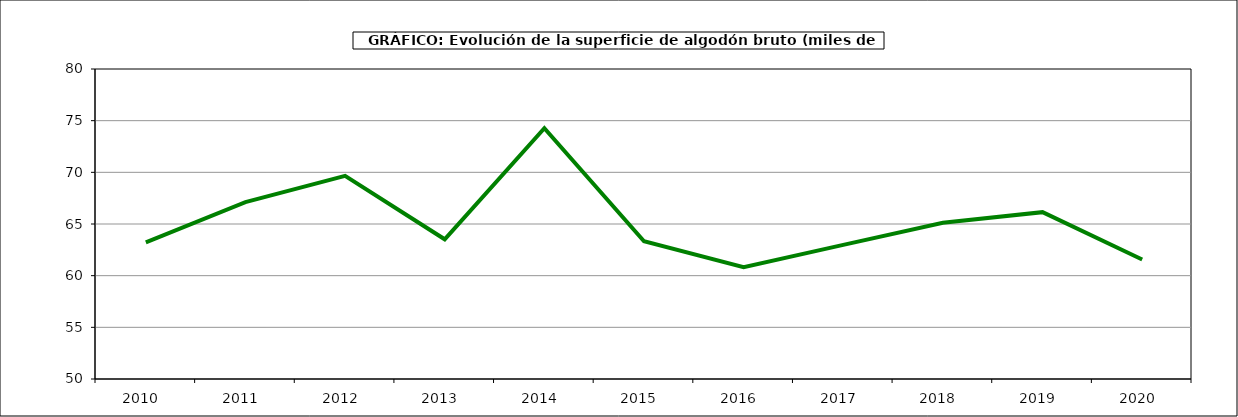
| Category | Superficie |
|---|---|
| 2010.0 | 63.217 |
| 2011.0 | 67.118 |
| 2012.0 | 69.662 |
| 2013.0 | 63.52 |
| 2014.0 | 74.265 |
| 2015.0 | 63.326 |
| 2016.0 | 60.814 |
| 2017.0 | 62.982 |
| 2018.0 | 65.121 |
| 2019.0 | 66.147 |
| 2020.0 | 61.568 |